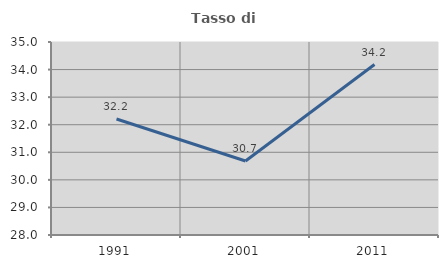
| Category | Tasso di occupazione   |
|---|---|
| 1991.0 | 32.206 |
| 2001.0 | 30.682 |
| 2011.0 | 34.184 |